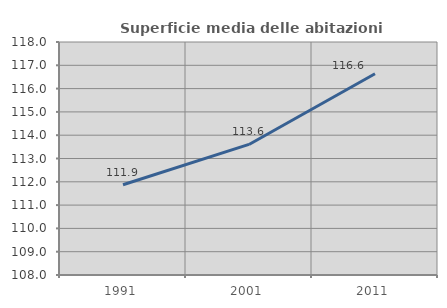
| Category | Superficie media delle abitazioni occupate |
|---|---|
| 1991.0 | 111.874 |
| 2001.0 | 113.603 |
| 2011.0 | 116.639 |